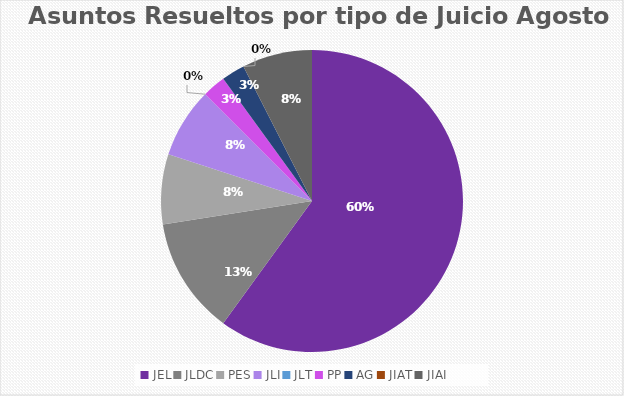
| Category | Asuntos Resueltos por tipo de Juicio  AGOSTO |
|---|---|
| JEL | 24 |
| JLDC | 5 |
| PES | 3 |
| JLI | 3 |
| JLT | 0 |
| PP | 1 |
| AG | 1 |
| JIAT | 0 |
| JIAI | 3 |